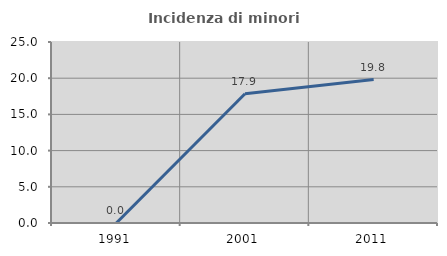
| Category | Incidenza di minori stranieri |
|---|---|
| 1991.0 | 0 |
| 2001.0 | 17.857 |
| 2011.0 | 19.811 |